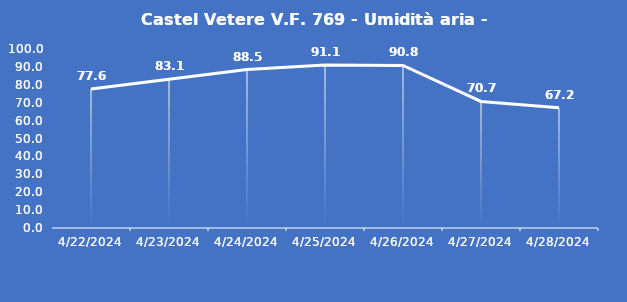
| Category | Castel Vetere V.F. 769 - Umidità aria - Grezzo (%) |
|---|---|
| 4/22/24 | 77.6 |
| 4/23/24 | 83.1 |
| 4/24/24 | 88.5 |
| 4/25/24 | 91.1 |
| 4/26/24 | 90.8 |
| 4/27/24 | 70.7 |
| 4/28/24 | 67.2 |